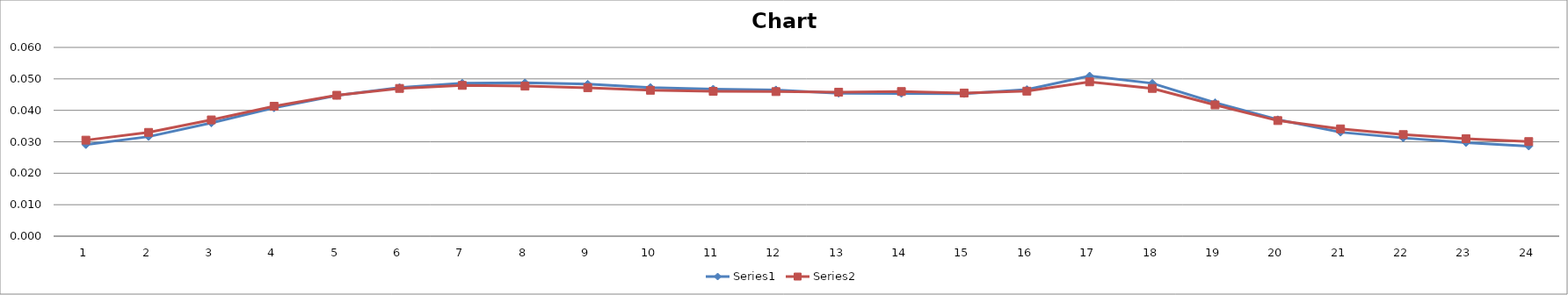
| Category | Series 0 | Series 1 |
|---|---|---|
| 0 | 0.029 | 0.031 |
| 1 | 0.032 | 0.033 |
| 2 | 0.036 | 0.037 |
| 3 | 0.041 | 0.041 |
| 4 | 0.045 | 0.045 |
| 5 | 0.047 | 0.047 |
| 6 | 0.049 | 0.048 |
| 7 | 0.049 | 0.048 |
| 8 | 0.048 | 0.047 |
| 9 | 0.047 | 0.046 |
| 10 | 0.047 | 0.046 |
| 11 | 0.046 | 0.046 |
| 12 | 0.045 | 0.046 |
| 13 | 0.045 | 0.046 |
| 14 | 0.045 | 0.046 |
| 15 | 0.047 | 0.046 |
| 16 | 0.051 | 0.049 |
| 17 | 0.049 | 0.047 |
| 18 | 0.042 | 0.042 |
| 19 | 0.037 | 0.037 |
| 20 | 0.033 | 0.034 |
| 21 | 0.031 | 0.032 |
| 22 | 0.03 | 0.031 |
| 23 | 0.029 | 0.03 |